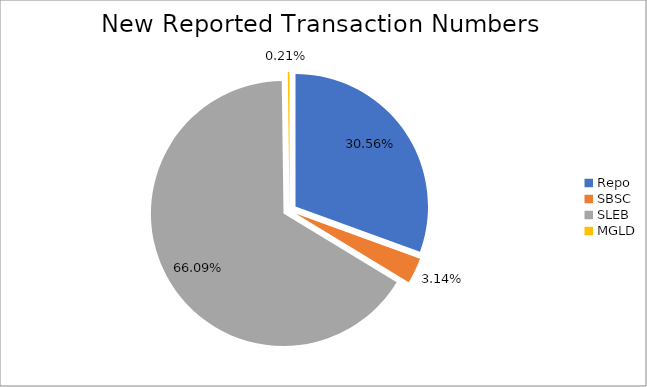
| Category | Series 0 |
|---|---|
| Repo | 429633 |
| SBSC | 44133 |
| SLEB | 929200 |
| MGLD | 2947 |